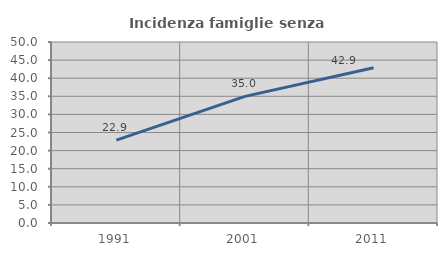
| Category | Incidenza famiglie senza nuclei |
|---|---|
| 1991.0 | 22.883 |
| 2001.0 | 34.973 |
| 2011.0 | 42.874 |